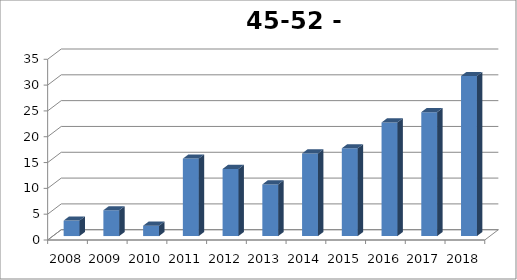
| Category | Esch |
|---|---|
| 2008.0 | 3 |
| 2009.0 | 5 |
| 2010.0 | 2 |
| 2011.0 | 15 |
| 2012.0 | 13 |
| 2013.0 | 10 |
| 2014.0 | 16 |
| 2015.0 | 17 |
| 2016.0 | 22 |
| 2017.0 | 24 |
| 2018.0 | 31 |